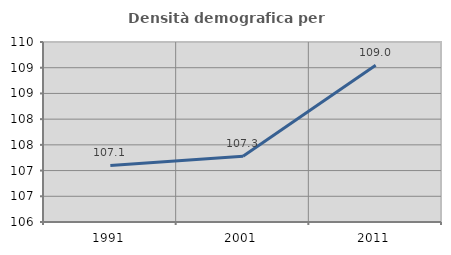
| Category | Densità demografica |
|---|---|
| 1991.0 | 107.1 |
| 2001.0 | 107.277 |
| 2011.0 | 109.047 |